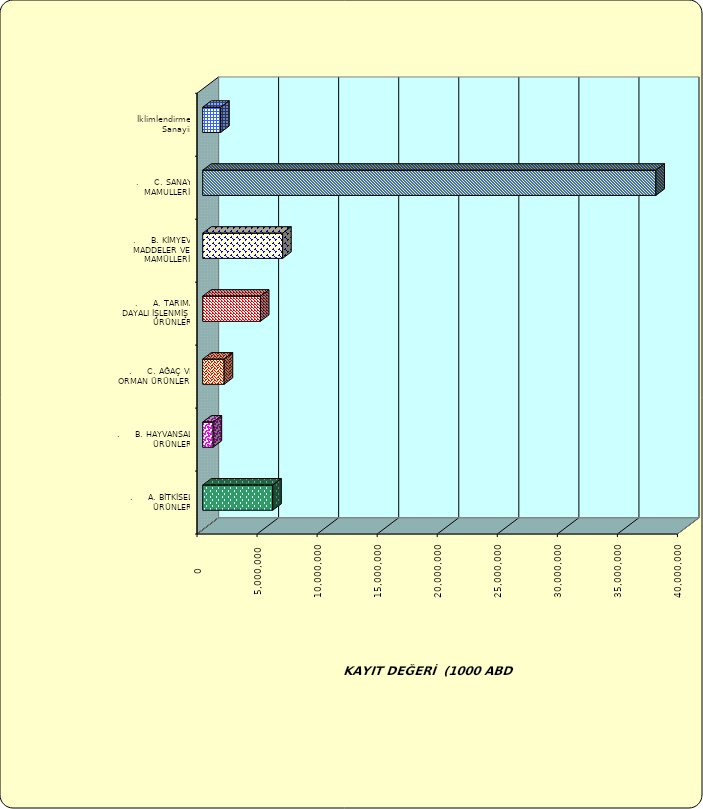
| Category | Series 0 |
|---|---|
| .     A. BİTKİSEL ÜRÜNLER | 5829677.672 |
| .     B. HAYVANSAL ÜRÜNLER | 863383.871 |
| .     C. AĞAÇ VE ORMAN ÜRÜNLERİ | 1785679.915 |
| .     A. TARIMA DAYALI İŞLENMİŞ ÜRÜNLER | 4803611.691 |
| .     B. KİMYEVİ MADDELER VE MAMÜLLERİ | 6655115.271 |
| .     C. SANAYİ MAMULLERİ | 37728858.482 |
|  İklimlendirme Sanayii | 1495924.798 |